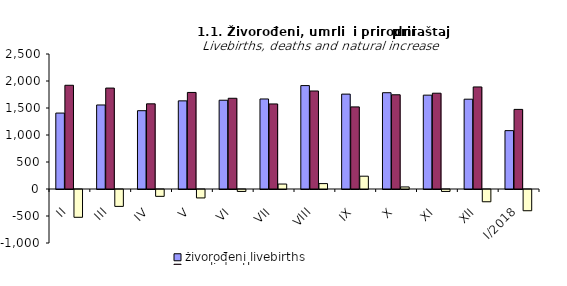
| Category | živorođeni livebirths | umrli deaths | prirodni priraštaj natural increase |
|---|---|---|---|
| II | 1406 | 1921 | -515 |
| III | 1556 | 1869 | -313 |
| IV | 1450 | 1577 | -127 |
| V | 1632 | 1788 | -156 |
| VI | 1644 | 1680 | -36 |
| VII | 1667 | 1575 | 92 |
| VIII | 1915 | 1815 | 100 |
| IX | 1757 | 1520 | 237 |
| X | 1783 | 1745 | 38 |
| XI | 1738 | 1774 | -36 |
| XII | 1663 | 1890 | -227 |
| I/2018 | 1081 | 1474 | -393 |